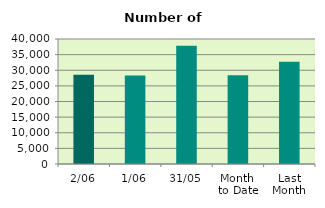
| Category | Series 0 |
|---|---|
| 2/06 | 28534 |
| 1/06 | 28322 |
| 31/05 | 37810 |
| Month 
to Date | 28428 |
| Last
Month | 32723.818 |